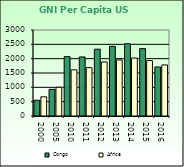
| Category | Congo | Africa                        |
|---|---|---|
| 2000.0 | 550 | 668.557 |
| 2005.0 | 930 | 1002.896 |
| 2010.0 | 2070 | 1608.999 |
| 2011.0 | 2060 | 1686.521 |
| 2012.0 | 2330 | 1885.129 |
| 2013.0 | 2430 | 1956.671 |
| 2014.0 | 2520 | 2022.289 |
| 2015.0 | 2350 | 1932.283 |
| 2016.0 | 1710 | 1781.415 |